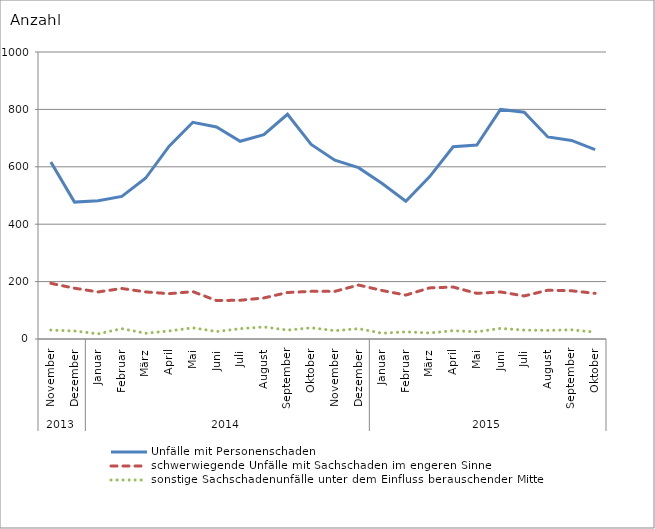
| Category | Unfälle mit Personenschaden | schwerwiegende Unfälle mit Sachschaden im engeren Sinne | sonstige Sachschadenunfälle unter dem Einfluss berauschender Mittel |
|---|---|---|---|
| 0 | 617 | 194 | 31 |
| 1 | 477 | 177 | 28 |
| 2 | 482 | 164 | 18 |
| 3 | 497 | 176 | 36 |
| 4 | 560 | 164 | 20 |
| 5 | 672 | 158 | 28 |
| 6 | 755 | 165 | 39 |
| 7 | 739 | 134 | 26 |
| 8 | 689 | 135 | 36 |
| 9 | 712 | 143 | 42 |
| 10 | 783 | 162 | 31 |
| 11 | 678 | 166 | 39 |
| 12 | 623 | 166 | 29 |
| 13 | 597 | 188 | 36 |
| 14 | 542 | 169 | 20 |
| 15 | 480 | 153 | 25 |
| 16 | 565 | 178 | 21 |
| 17 | 670 | 181 | 29 |
| 18 | 676 | 159 | 25 |
| 19 | 800 | 164 | 37 |
| 20 | 790 | 150 | 31 |
| 21 | 704 | 170 | 30 |
| 22 | 692 | 168 | 32 |
| 23 | 660 | 159 | 24 |